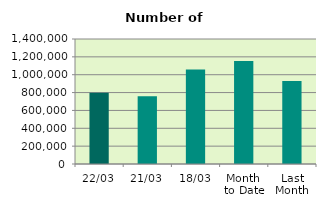
| Category | Series 0 |
|---|---|
| 22/03 | 797876 |
| 21/03 | 759030 |
| 18/03 | 1058414 |
| Month 
to Date | 1153790.625 |
| Last
Month | 928647.7 |